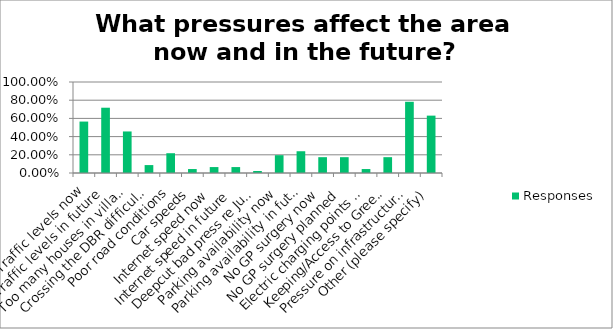
| Category | Responses |
|---|---|
| Traffic levels now | 0.565 |
| Traffic levels in future | 0.717 |
| Too many houses in village | 0.456 |
| Crossing the DBR difficult at times | 0.087 |
| Poor road conditions | 0.217 |
| Car speeds | 0.044 |
| Internet speed now | 0.065 |
| Internet speed in future | 0.065 |
| Deepcut bad press re Junior Soldier Deaths | 0.022 |
| Parking availability now | 0.196 |
| Parking availability in future | 0.239 |
| No GP surgery now | 0.174 |
| No GP surgery planned | 0.174 |
| Electric charging points needed for future | 0.044 |
| Keeping/Access to Green Spaces | 0.174 |
| Pressure on infrastructure from 1200+ homes | 0.783 |
| Other (please specify) | 0.63 |